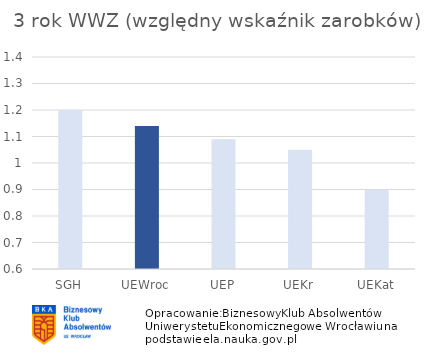
| Category | 3 rok WWZ (względny wskaźnik zarobków) |
|---|---|
| SGH | 1.2 |
| UEWroc | 1.14 |
| UEP | 1.09 |
| UEKr | 1.05 |
| UEKat | 0.9 |